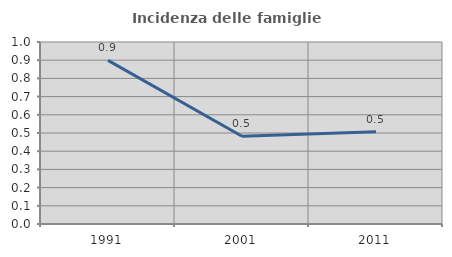
| Category | Incidenza delle famiglie numerose |
|---|---|
| 1991.0 | 0.899 |
| 2001.0 | 0.482 |
| 2011.0 | 0.506 |